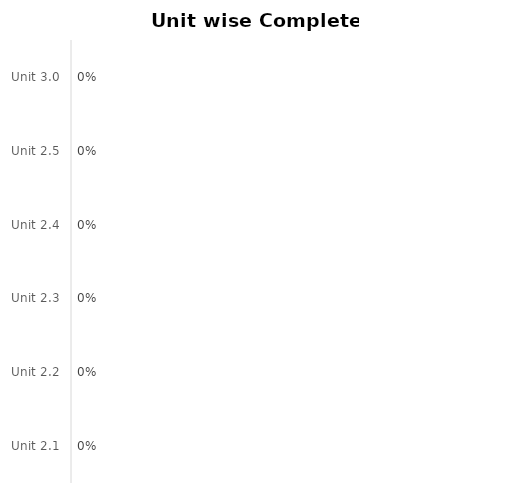
| Category | Complete % |
|---|---|
| Unit 2.1 | 0 |
| Unit 2.2 | 0 |
| Unit 2.3 | 0 |
| Unit 2.4 | 0 |
| Unit 2.5 | 0 |
| Unit 3.0 | 0 |